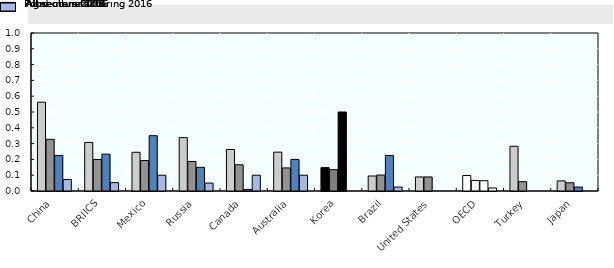
| Category | All sectors 2003 | All sectors 2016 | Agriculture 2016 | Food manufacturing 2016 |
|---|---|---|---|---|
| China | 0.562 | 0.327 | 0.225 | 0.073 |
| BRIICS | 0.307 | 0.2 | 0.233 | 0.053 |
| Mexico | 0.245 | 0.193 | 0.35 | 0.1 |
| Russia | 0.338 | 0.187 | 0.15 | 0.05 |
| Canada | 0.263 | 0.166 | 0.01 | 0.1 |
| Australia | 0.246 | 0.146 | 0.2 | 0.1 |
| Korea | 0.148 | 0.135 | 0.5 | 0 |
| Brazil | 0.095 | 0.101 | 0.225 | 0.025 |
| United States | 0.089 | 0.089 | 0 | 0 |
| OECD | 0.098 | 0.067 | 0.065 | 0.019 |
| Turkey | 0.283 | 0.059 | 0 | 0 |
| Japan | 0.064 | 0.052 | 0.025 | 0 |